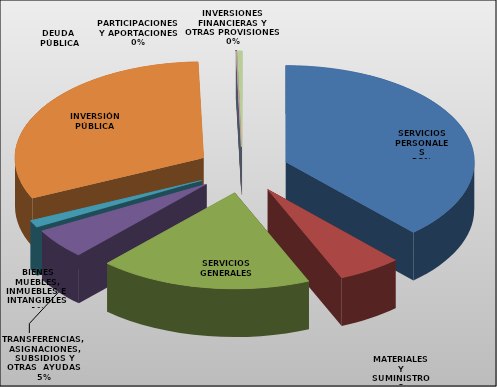
| Category | Series 0 |
|---|---|
| SERVICIOS PERSONALES | 29673534 |
| MATERIALES Y SUMINISTROS | 4227351 |
| SERVICIOS GENERALES | 14199007 |
| TRANSFERENCIAS, ASIGNACIONES, SUBSIDIOS Y OTRAS  AYUDAS | 3927097 |
| BIENES MUEBLES, INMUEBLES E  INTANGIBLES  | 940183 |
| INVERSIÓN PÚBLICA | 24452410 |
| INVERSIONES FINANCIERAS Y OTRAS PROVISIONES | 27300 |
| PARTICIPACIONES Y APORTACIONES | 0 |
| DEUDA  PÚBLICA | 335000 |